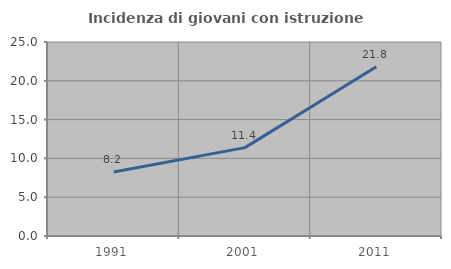
| Category | Incidenza di giovani con istruzione universitaria |
|---|---|
| 1991.0 | 8.247 |
| 2001.0 | 11.386 |
| 2011.0 | 21.818 |